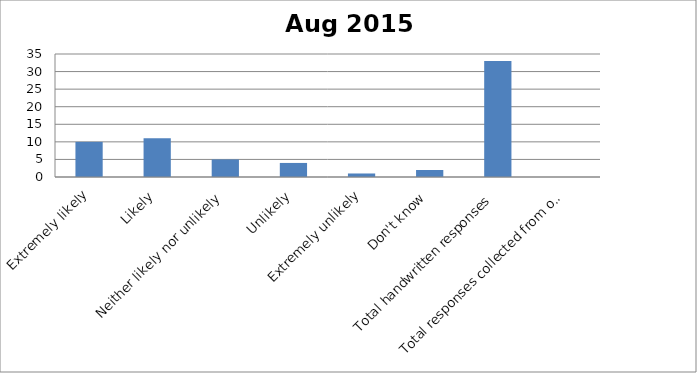
| Category | Series 0 |
|---|---|
| Extremely likely | 10 |
| Likely | 11 |
| Neither likely nor unlikely | 5 |
| Unlikely | 4 |
| Extremely unlikely | 1 |
| Don't know | 2 |
| Total handwritten responses | 33 |
| Total responses collected from other methods | 0 |